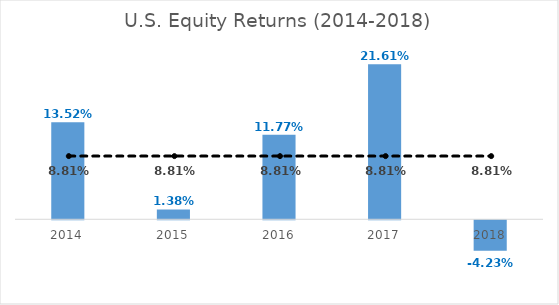
| Category | Equity Return |
|---|---|
| 2014.0 | 0.135 |
| 2015.0 | 0.014 |
| 2016.0 | 0.118 |
| 2017.0 | 0.216 |
| 2018.0 | -0.042 |